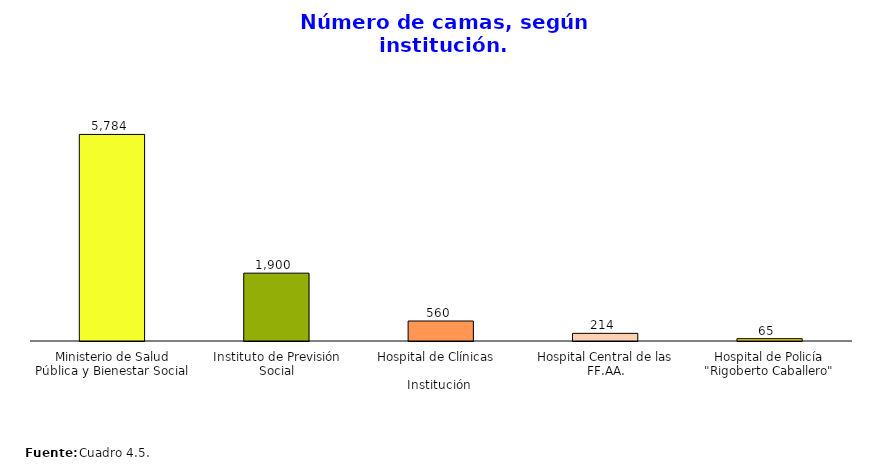
| Category | Series 0 |
|---|---|
| Ministerio de Salud Pública y Bienestar Social | 5784 |
| Instituto de Previsión Social | 1900 |
| Hospital de Clínicas   | 560 |
| Hospital Central de las FF.AA. | 214 |
| Hospital de Policía "Rigoberto Caballero" | 65 |